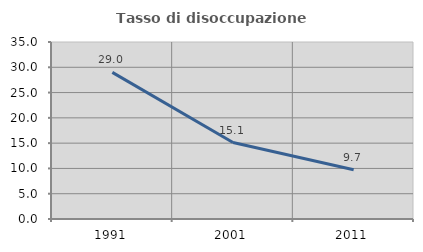
| Category | Tasso di disoccupazione giovanile  |
|---|---|
| 1991.0 | 29 |
| 2001.0 | 15.116 |
| 2011.0 | 9.722 |